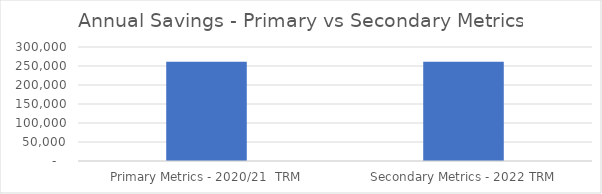
| Category | Series 0 |
|---|---|
|  Primary Metrics - 2020/21  TRM  | 261276.626 |
|  Secondary Metrics - 2022 TRM  | 260952.677 |